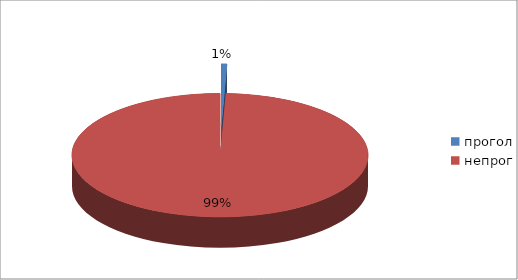
| Category | Series 0 |
|---|---|
| прогол | 1 |
| непрог | 162 |